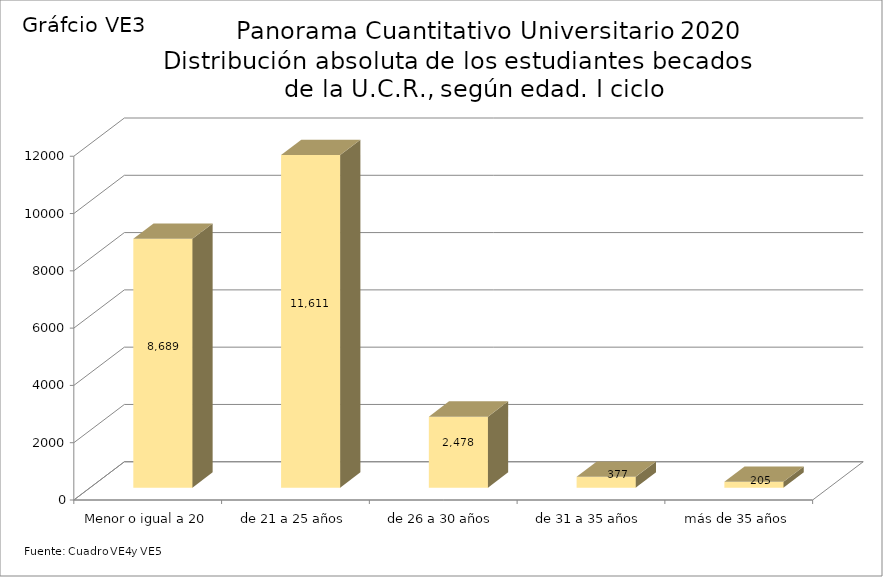
| Category | Series 0 |
|---|---|
| Menor o igual a 20 | 8689 |
| de 21 a 25 años | 11611 |
| de 26 a 30 años | 2478 |
| de 31 a 35 años | 377 |
| más de 35 años | 205 |